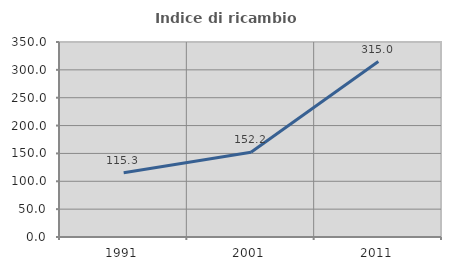
| Category | Indice di ricambio occupazionale  |
|---|---|
| 1991.0 | 115.266 |
| 2001.0 | 152.217 |
| 2011.0 | 314.964 |